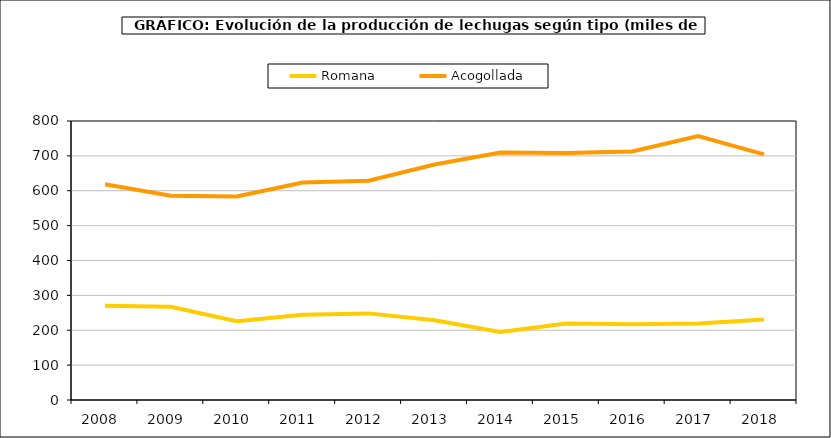
| Category | Romana | Acogollada |
|---|---|---|
| 2008.0 | 270.572 | 618.661 |
| 2009.0 | 267.562 | 585.426 |
| 2010.0 | 225.829 | 583.561 |
| 2011.0 | 244.577 | 623.859 |
| 2012.0 | 248.374 | 628.552 |
| 2013.0 | 228.928 | 675.355 |
| 2014.0 | 195.068 | 709.734 |
| 2015.0 | 219.245 | 708.133 |
| 2016.0 | 217.427 | 712.517 |
| 2017.0 | 219.317 | 756.795 |
| 2018.0 | 230.508 | 704.162 |